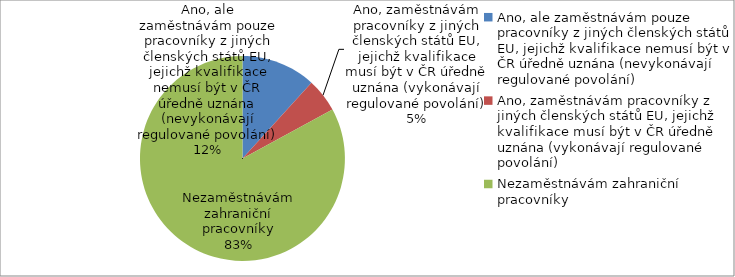
| Category | Series 0 |
|---|---|
| Ano, ale zaměstnávám pouze pracovníky z jiných členských států EU, jejichž kvalifikace nemusí být v ČR úředně uznána (nevykonávají regulované povolání) | 93 |
| Ano, zaměstnávám pracovníky z jiných členských států EU, jejichž kvalifikace musí být v ČR úředně uznána (vykonávají regulované povolání) | 42 |
| Nezaměstnávám zahraniční pracovníky | 657 |